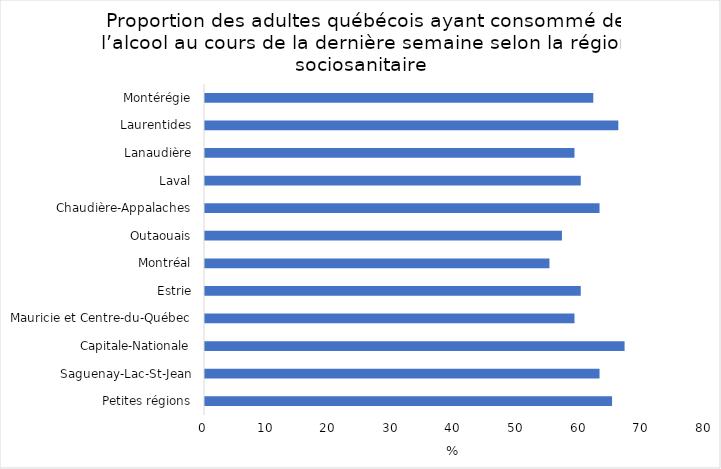
| Category | Series 0 |
|---|---|
| Petites régions | 65 |
| Saguenay-Lac-St-Jean | 63 |
| Capitale-Nationale | 67 |
| Mauricie et Centre-du-Québec | 59 |
| Estrie | 60 |
| Montréal | 55 |
| Outaouais | 57 |
| Chaudière-Appalaches | 63 |
| Laval | 60 |
| Lanaudière | 59 |
| Laurentides | 66 |
| Montérégie | 62 |